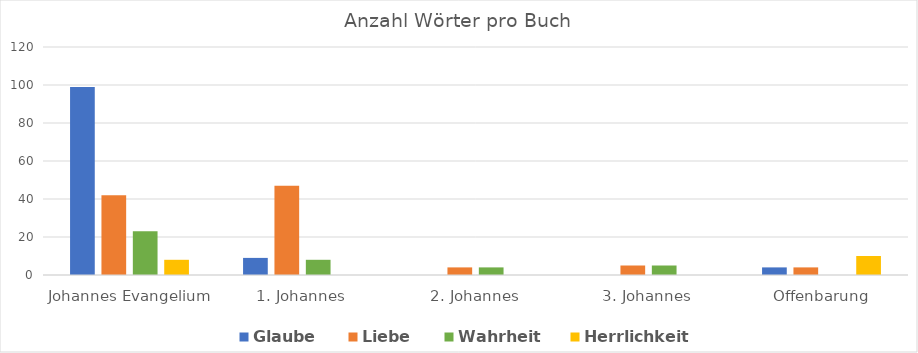
| Category | Glaube | Liebe | Wahrheit | Herrlichkeit |
|---|---|---|---|---|
| Johannes Evangelium | 99 | 42 | 23 | 8 |
| 1. Johannes | 9 | 47 | 8 | 0 |
| 2. Johannes | 0 | 4 | 4 | 0 |
| 3. Johannes | 0 | 5 | 5 | 0 |
| Offenbarung | 4 | 4 | 0 | 10 |